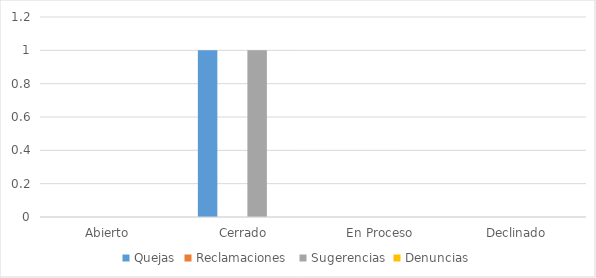
| Category | Quejas | Reclamaciones  | Sugerencias | Denuncias |
|---|---|---|---|---|
| Abierto | 0 | 0 | 0 | 0 |
| Cerrado | 1 | 0 | 1 | 0 |
| En Proceso | 0 | 0 | 0 | 0 |
| Declinado | 0 | 0 | 0 | 0 |